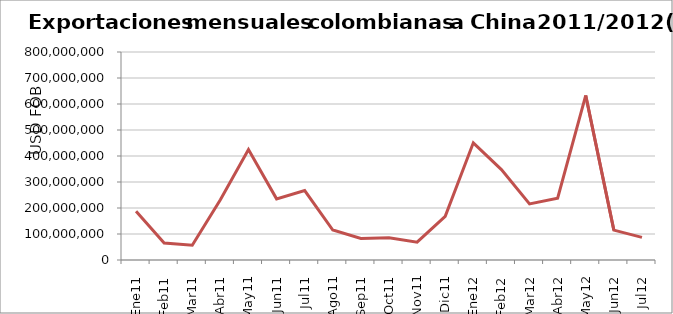
| Category | Series 0 |
|---|---|
| 0 | 187054431.26 |
| 1 | 65485944.12 |
| 2 | 56707343.85 |
| 3 | 231711214.75 |
| 4 | 425018555.38 |
| 5 | 235128477.21 |
| 6 | 267081972.64 |
| 7 | 115383209.37 |
| 8 | 82999280.24 |
| 9 | 85621209.42 |
| 10 | 68710977.77 |
| 11 | 168158629.98 |
| 12 | 450666352.75 |
| 13 | 347804454.38 |
| 14 | 215615762.91 |
| 15 | 237766902.55 |
| 16 | 632827081.06 |
| 17 | 114894410.82 |
| 18 | 87005871.89 |